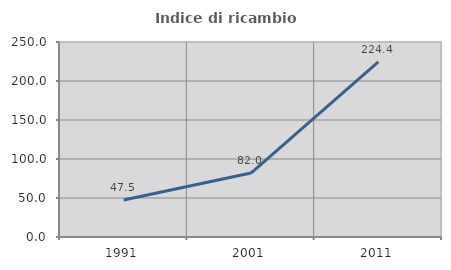
| Category | Indice di ricambio occupazionale  |
|---|---|
| 1991.0 | 47.468 |
| 2001.0 | 81.967 |
| 2011.0 | 224.444 |